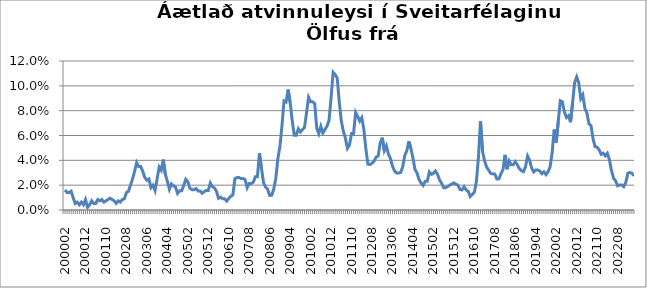
| Category | Series 0 |
|---|---|
| 200002 | 0.016 |
| 200003 | 0.014 |
| 200004 | 0.014 |
| 200005 | 0.015 |
| 200006 | 0.01 |
| 200007 | 0.005 |
| 200008 | 0.006 |
| 200009 | 0.004 |
| 200010 | 0.006 |
| 200011 | 0.004 |
| 200012 | 0.008 |
| 200101 | 0.002 |
| 200102 | 0.004 |
| 200103 | 0.007 |
| 200104 | 0.005 |
| 200105 | 0.005 |
| 200106 | 0.008 |
| 200107 | 0.007 |
| 200108 | 0.008 |
| 200109 | 0.006 |
| 200110 | 0.007 |
| 200111 | 0.008 |
| 200112 | 0.009 |
| 200201 | 0.008 |
| 200202 | 0.007 |
| 200203 | 0.005 |
| 200204 | 0.007 |
| 200205 | 0.006 |
| 200206 | 0.008 |
| 200207 | 0.009 |
| 200208 | 0.014 |
| 200209 | 0.015 |
| 200210 | 0.02 |
| 200211 | 0.025 |
| 200212 | 0.031 |
| 200301 | 0.038 |
| 200302 | 0.035 |
| 200303 | 0.035 |
| 200304 | 0.031 |
| 200305 | 0.026 |
| 200306 | 0.024 |
| 200307 | 0.025 |
| 200308 | 0.018 |
| 200309 | 0.02 |
| 200310 | 0.016 |
| 200311 | 0.025 |
| 200312 | 0.035 |
| 200401 | 0.032 |
| 200402 | 0.041 |
| 200403 | 0.029 |
| 200404 | 0.023 |
| 200405 | 0.017 |
| 200406 | 0.021 |
| 200407 | 0.019 |
| 200408 | 0.018 |
| 200409 | 0.013 |
| 200410 | 0.016 |
| 200411 | 0.016 |
| 200412 | 0.02 |
| 200501 | 0.025 |
| 200502 | 0.023 |
| 200503 | 0.018 |
| 200504 | 0.016 |
| 200505 | 0.016 |
| 200506 | 0.017 |
| 200507 | 0.015 |
| 200508 | 0.015 |
| 200509 | 0.013 |
| 200510 | 0.015 |
| 200511 | 0.016 |
| 200512 | 0.016 |
| 200601 | 0.022 |
| 200602 | 0.019 |
| 200603 | 0.018 |
| 200604 | 0.015 |
| 200605 | 0.009 |
| 200606 | 0.01 |
| 200607 | 0.009 |
| 200608 | 0.009 |
| 200609 | 0.007 |
| 200610 | 0.009 |
| 200611 | 0.011 |
| 200612 | 0.012 |
| 200701 | 0.025 |
| 200702 | 0.026 |
| 200703 | 0.026 |
| 200704 | 0.025 |
| 200705 | 0.025 |
| 200706 | 0.024 |
| 200707 | 0.018 |
| 200708 | 0.021 |
| 200709 | 0.021 |
| 200710 | 0.022 |
| 200711 | 0.027 |
| 200712 | 0.027 |
| 200801 | 0.046 |
| 200802 | 0.033 |
| 200803 | 0.022 |
| 200804 | 0.018 |
| 200805 | 0.017 |
| 200806 | 0.012 |
| 200807 | 0.012 |
| 200808 | 0.017 |
| 200809 | 0.025 |
| 200810 | 0.041 |
| 200811 | 0.051 |
| 200812 | 0.068 |
| 200901 | 0.088 |
| 200902 | 0.087 |
| 200903 | 0.097 |
| 200904 | 0.087 |
| 200905 | 0.072 |
| 200906 | 0.06 |
| 200907 | 0.06 |
| 200908 | 0.065 |
| 200909 | 0.063 |
| 200910 | 0.065 |
| 200911 | 0.066 |
| 200912 | 0.078 |
| 201001 | 0.091 |
| 201002 | 0.087 |
| 201003 | 0.087 |
| 201004 | 0.086 |
| 201005 | 0.066 |
| 201006 | 0.061 |
| 201007 | 0.067 |
| 201008 | 0.062 |
| 201009 | 0.065 |
| 201010 | 0.068 |
| 201011 | 0.072 |
| 201012 | 0.09 |
| 201101 | 0.111 |
| 201102 | 0.109 |
| 201103 | 0.106 |
| 201104 | 0.087 |
| 201105 | 0.072 |
| 201106 | 0.063 |
| 201107 | 0.058 |
| 201108 | 0.05 |
| 201109 | 0.052 |
| 201110 | 0.062 |
| 201111 | 0.062 |
| 201112 | 0.079 |
| 201201 | 0.075 |
| 201202 | 0.072 |
| 201203 | 0.074 |
| 201204 | 0.065 |
| 201205 | 0.049 |
| 201206 | 0.037 |
| 201207 | 0.037 |
| 201208 | 0.038 |
| 201209 | 0.039 |
| 201210 | 0.043 |
| 201211 | 0.043 |
| 201212 | 0.054 |
| 201301 | 0.058 |
| 201302 | 0.048 |
| 201303 | 0.052 |
| 201304 | 0.045 |
| 201305 | 0.042 |
| 201306 | 0.035 |
| 201307 | 0.032 |
| 201308 | 0.03 |
| 201309 | 0.03 |
| 201310 | 0.03 |
| 201311 | 0.035 |
| 201312 | 0.044 |
| 201401 | 0.048 |
| 201402 | 0.055 |
| 201403 | 0.05 |
| 201404 | 0.042 |
| 201405 | 0.033 |
| 201406 | 0.03 |
| 201407 | 0.024 |
| 201408 | 0.022 |
| 201409 | 0.02 |
| 201410 | 0.023 |
| 201411 | 0.023 |
| 201412 | 0.031 |
| 201501 | 0.029 |
| 201502 | 0.03 |
| 201503 | 0.031 |
| 201504 | 0.029 |
| 201505 | 0.024 |
| 201506 | 0.022 |
| 201507 | 0.018 |
| 201508 | 0.018 |
| 201509 | 0.019 |
| 201510 | 0.02 |
| 201511 | 0.021 |
| 201512 | 0.022 |
| 201601 | 0.021 |
| 201602 | 0.02 |
| 201603 | 0.016 |
| 201604 | 0.016 |
| 201605 | 0.019 |
| 201606 | 0.016 |
| 201607 | 0.015 |
| 201608 | 0.011 |
| 201609 | 0.013 |
| 201610 | 0.014 |
| 201611 | 0.023 |
| 201612 | 0.042 |
| 201701 | 0.072 |
| 201702 | 0.047 |
| 201703 | 0.04 |
| 201704 | 0.035 |
| 201705 | 0.032 |
| 201706 | 0.029 |
| 201707 | 0.029 |
| 201708 | 0.029 |
| 201709 | 0.025 |
| 201710 | 0.025 |
| 201711 | 0.029 |
| 201712 | 0.032 |
| 201801 | 0.044 |
| 201802 | 0.033 |
| 201803 | 0.039 |
| 201804 | 0.036 |
| 201805 | 0.036 |
| 201806 | 0.039 |
| 201807 | 0.036 |
| 201808 | 0.033 |
| 201809 | 0.032 |
| 201810 | 0.031 |
| 201811 | 0.035 |
| 201812 | 0.043 |
| 201901 | 0.04 |
| 201902 | 0.034 |
| 201903 | 0.031 |
| 201904 | 0.032 |
| 201905 | 0.032 |
| 201906 | 0.031 |
| 201907 | 0.029 |
| 201908 | 0.031 |
| 201909 | 0.028 |
| 201910 | 0.031 |
| 201911 | 0.035 |
| 201912 | 0.046 |
| 202001 | 0.065 |
| 202002 | 0.054 |
| 202003 | 0.071 |
| 202004 | 0.088 |
| 202005 | 0.087 |
| 202006 | 0.079 |
| 202007 | 0.074 |
| 202008 | 0.076 |
| 202009 | 0.071 |
| 202010 | 0.086 |
| 202011 | 0.103 |
| 202012 | 0.107 |
| 202101 | 0.102 |
| 202102 | 0.09 |
| 202103 | 0.093 |
| 202104 | 0.082 |
| 202105 | 0.078 |
| 202106 | 0.069 |
| 202107 | 0.068 |
| 202108 | 0.057 |
| 202109 | 0.051 |
| 202110 | 0.051 |
| 202111 | 0.048 |
| 202112 | 0.045 |
| 202201 | 0.046 |
| 202202 | 0.044 |
| 202203 | 0.046 |
| 202204 | 0.041 |
| 202205 | 0.032 |
| 202206 | 0.026 |
| 202207 | 0.024 |
| 202208 | 0.019 |
| 202209 | 0.02 |
| 202210 | 0.02 |
| 202211 | 0.019 |
| 202212 | 0.022 |
| 202301 | 0.03 |
| 202302 | 0.03 |
| 202303 | 0.03 |
| 202304 | 0.028 |